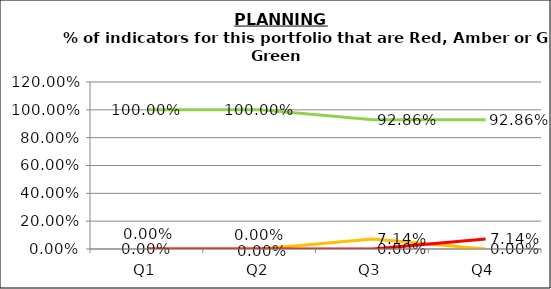
| Category | Green | Amber | Red |
|---|---|---|---|
| Q1 | 1 | 0 | 0 |
| Q2 | 1 | 0 | 0 |
| Q3 | 0.929 | 0.071 | 0 |
| Q4 | 0.929 | 0 | 0.071 |